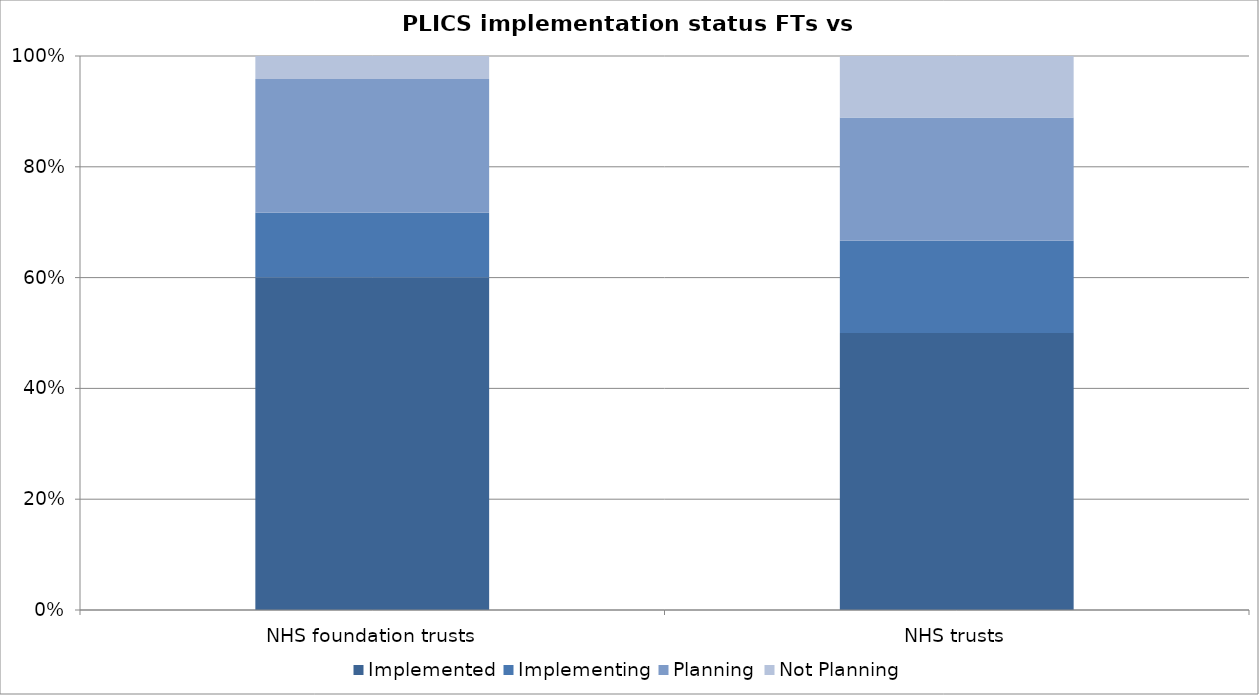
| Category | Implemented | Implementing | Planning | Not Planning |
|---|---|---|---|---|
| NHS foundation trusts | 87 | 17 | 35 | 6 |
| NHS trusts | 45 | 15 | 20 | 10 |